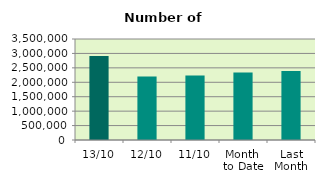
| Category | Series 0 |
|---|---|
| 13/10 | 2915108 |
| 12/10 | 2197630 |
| 11/10 | 2234868 |
| Month 
to Date | 2336086.667 |
| Last
Month | 2392468.182 |